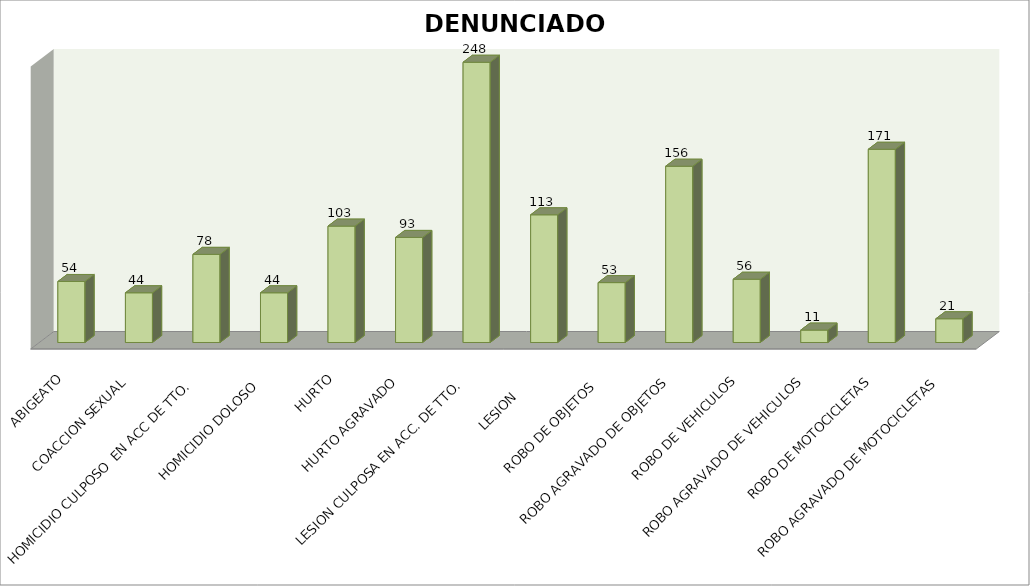
| Category | DENUNCIADOS |
|---|---|
| ABIGEATO | 54 |
| COACCION SEXUAL | 44 |
| HOMICIDIO CULPOSO  EN ACC DE TTO.  | 78 |
| HOMICIDIO DOLOSO  | 44 |
| HURTO | 103 |
| HURTO AGRAVADO | 93 |
| LESION CULPOSA EN ACC. DE TTO. | 248 |
| LESION      | 113 |
| ROBO DE OBJETOS  | 53 |
| ROBO AGRAVADO DE OBJETOS | 156 |
| ROBO DE VEHICULOS | 56 |
| ROBO AGRAVADO DE VEHICULOS | 11 |
| ROBO DE MOTOCICLETAS | 171 |
| ROBO AGRAVADO DE MOTOCICLETAS | 21 |